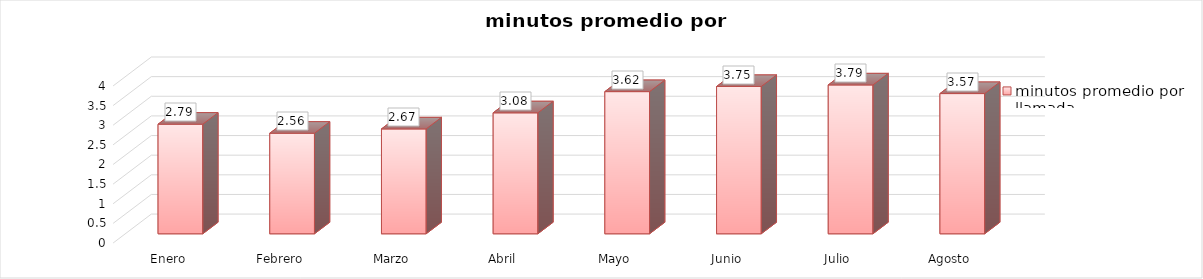
| Category | minutos promedio por llamada |
|---|---|
| Enero | 2.79 |
| Febrero | 2.56 |
| Marzo | 2.67 |
| Abril | 3.08 |
| Mayo | 3.62 |
| Junio | 3.75 |
| Julio | 3.79 |
| Agosto | 3.57 |